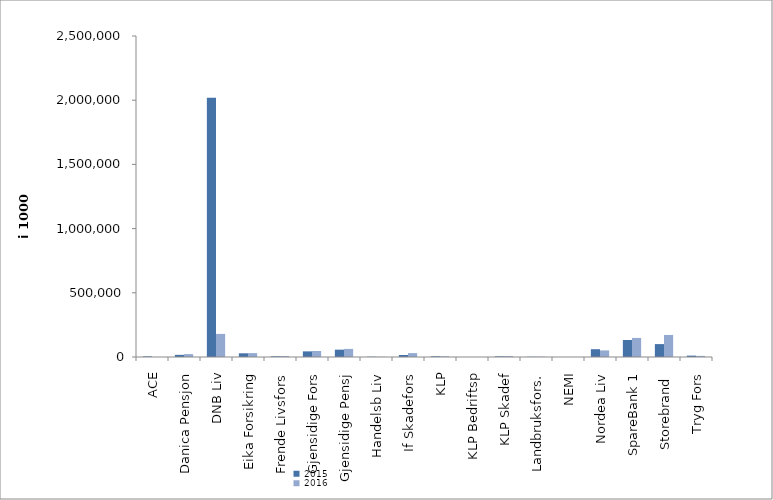
| Category | 2015 | 2016 |
|---|---|---|
| ACE | 4749.243 | 0 |
| Danica Pensjon | 16777.588 | 22511.96 |
| DNB Liv | 2018169.85 | 179864.131 |
| Eika Forsikring | 28805 | 30333 |
| Frende Livsfors | 5543 | 7925 |
| Gjensidige Fors | 43905 | 46539 |
| Gjensidige Pensj | 57128.895 | 62915.698 |
| Handelsb Liv | 2314 | 1569.289 |
| If Skadefors | 15494.393 | 30274.668 |
| KLP | 5654 | 5588 |
| KLP Bedriftsp | 0 | 0 |
| KLP Skadef | 5011 | 7374 |
| Landbruksfors. | 1793 | 2248 |
| NEMI | 0 | 0 |
| Nordea Liv | 60686.632 | 51242.431 |
| SpareBank 1 | 132318.306 | 148500 |
| Storebrand  | 100442.49 | 171741.256 |
| Tryg Fors | 10656 | 8554.6 |